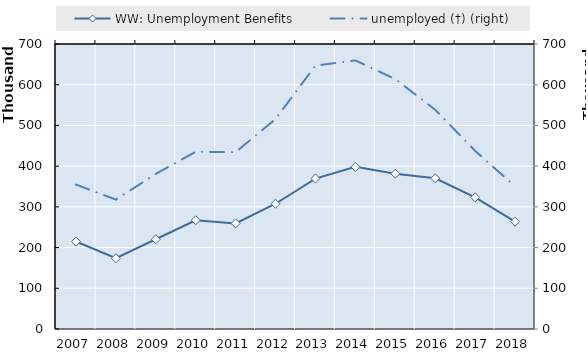
| Category | 0 | Series 14 | Series 15 | Series 16 | Series 17 | Series 18 | Series 19 | WW: Unemployment Benefits | Series 1 |
|---|---|---|---|---|---|---|---|---|---|
| 2007.0 |  |  |  |  |  |  |  | 214880 |  |
| 2008.0 |  |  |  |  |  |  |  | 173750 |  |
| 2009.0 |  |  |  |  |  |  |  | 220400 |  |
| 2010.0 |  |  |  |  |  |  |  | 267000 |  |
| 2011.0 |  |  |  |  |  |  |  | 259417.5 |  |
| 2012.0 |  |  |  |  |  |  |  | 307665 |  |
| 2013.0 |  |  |  |  |  |  |  | 369513 |  |
| 2014.0 |  |  |  |  |  |  |  | 398180 |  |
| 2015.0 |  |  |  |  |  |  |  | 381397 |  |
| 2016.0 |  |  |  |  |  |  |  | 370242 |  |
| 2017.0 |  |  |  |  |  |  |  | 323252 |  |
| 2018.0 |  |  |  |  |  |  |  | 263648.3 |  |